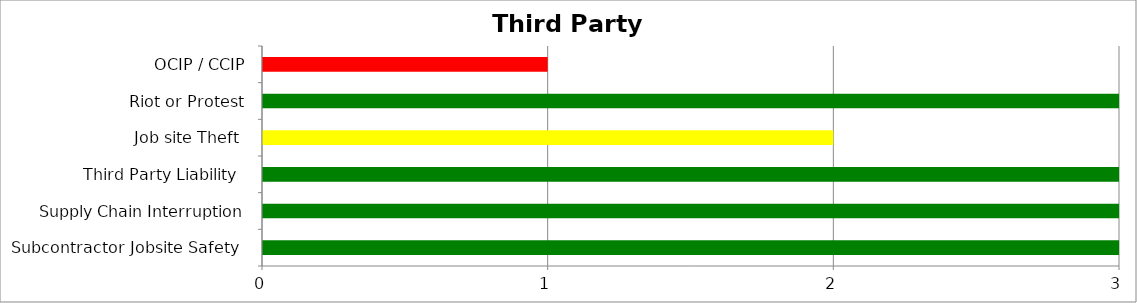
| Category | Low | Medium | High |
|---|---|---|---|
| Subcontractor Jobsite Safety  | 3 | 0 | 0 |
| Supply Chain Interruption | 3 | 0 | 0 |
| Third Party Liability  | 3 | 0 | 0 |
| Job site Theft  | 0 | 2 | 0 |
| Riot or Protest | 3 | 0 | 0 |
| OCIP / CCIP | 0 | 0 | 1 |